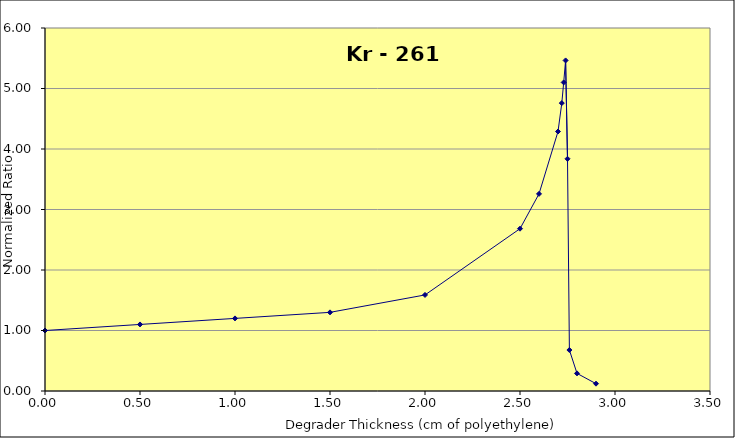
| Category | Series 0 |
|---|---|
| 0.0 | 1 |
| 0.5 | 1.1 |
| 1.0 | 1.2 |
| 1.5 | 1.3 |
| 2.0 | 1.588 |
| 2.5 | 2.683 |
| 2.6 | 3.258 |
| 2.7 | 4.289 |
| 2.72 | 4.759 |
| 2.73 | 5.1 |
| 2.74 | 5.464 |
| 2.75 | 3.838 |
| 2.76 | 0.677 |
| 2.8 | 0.291 |
| 2.9 | 0.121 |